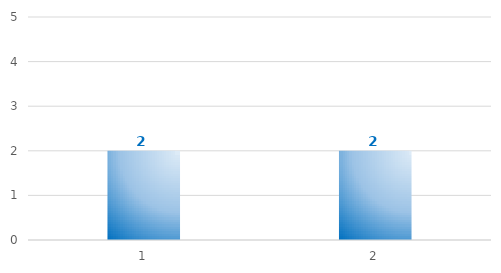
| Category | Series 0 |
|---|---|
| 0 | 2 |
| 1 | 2 |